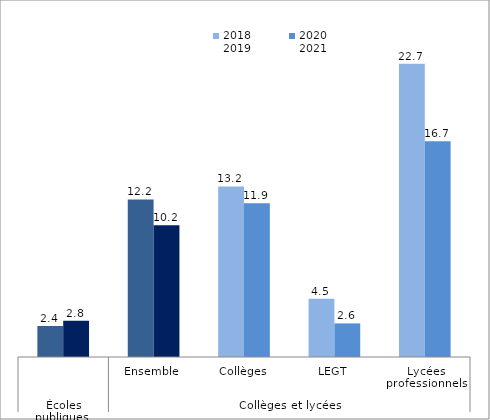
| Category | 2018
2019 | 2020
2021 |
|---|---|---|
| 0 | 2.4 | 2.8 |
| 1 | 12.2 | 10.2 |
| 2 | 13.2 | 11.9 |
| 3 | 4.5 | 2.6 |
| 4 | 22.7 | 16.7 |